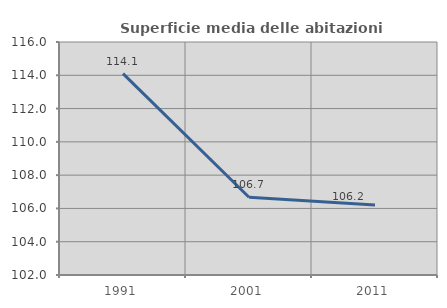
| Category | Superficie media delle abitazioni occupate |
|---|---|
| 1991.0 | 114.103 |
| 2001.0 | 106.67 |
| 2011.0 | 106.209 |